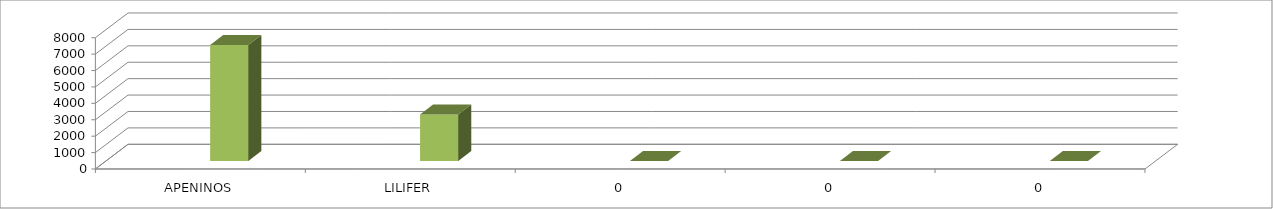
| Category | Series 0 | Series 1 | Series 2 | Series 3 |
|---|---|---|---|---|
| APENINOS |  |  | 7070 |  |
| LILIFER |  |  | 2835 |  |
| 0 |  |  | 0 |  |
| 0 |  |  | 0 |  |
| 0 |  |  | 0 |  |